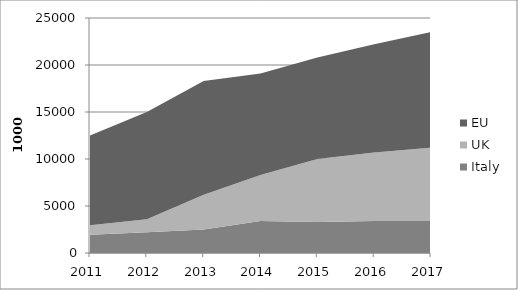
| Category | Italy | UK | EU |
|---|---|---|---|
| 2011.0 | 1950 | 1000 | 9550 |
| 2012.0 | 2200 | 1400 | 11400 |
| 2013.0 | 2500 | 3700 | 12100 |
| 2014.0 | 3400 | 4900 | 10800 |
| 2015.0 | 3300 | 6700 | 10800 |
| 2016.0 | 3400 | 7300 | 11500 |
| 2017.0 | 3400 | 7800 | 12300 |